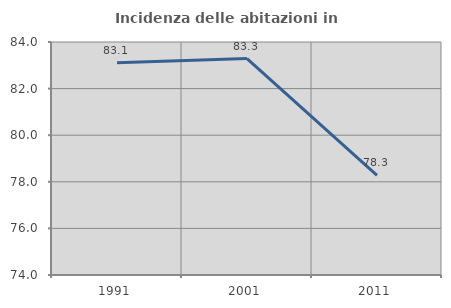
| Category | Incidenza delle abitazioni in proprietà  |
|---|---|
| 1991.0 | 83.113 |
| 2001.0 | 83.29 |
| 2011.0 | 78.272 |